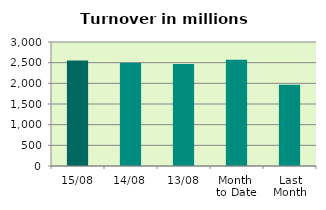
| Category | Series 0 |
|---|---|
| 15/08 | 2554.653 |
| 14/08 | 2500.442 |
| 13/08 | 2466.005 |
| Month 
to Date | 2572.996 |
| Last
Month | 1965.856 |